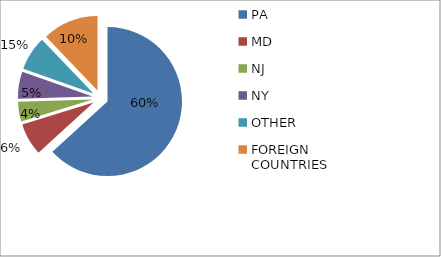
| Category | Series 1 | Series 0 |
|---|---|---|
| PA | 0.586 | 0.586 |
| MD | 0.065 | 0.065 |
| NJ | 0.04 | 0.04 |
| NY | 0.054 | 0.054 |
| OTHER | 0.069 | 0.069 |
| FOREIGN COUNTRIES | 0.113 | 0.113 |